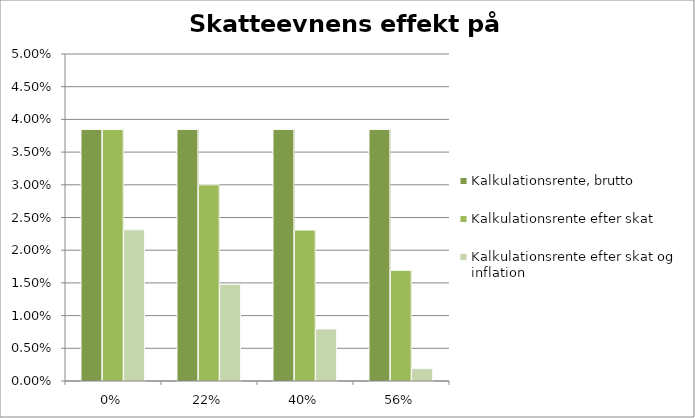
| Category | Kalkulationsrente, brutto | Kalkulationsrente efter skat | Kalkulationsrente efter skat og inflation |
|---|---|---|---|
| 0.0 | 0.038 | 0.038 | 0.023 |
| 0.22 | 0.038 | 0.03 | 0.015 |
| 0.4 | 0.038 | 0.023 | 0.008 |
| 0.56 | 0.038 | 0.017 | 0.002 |